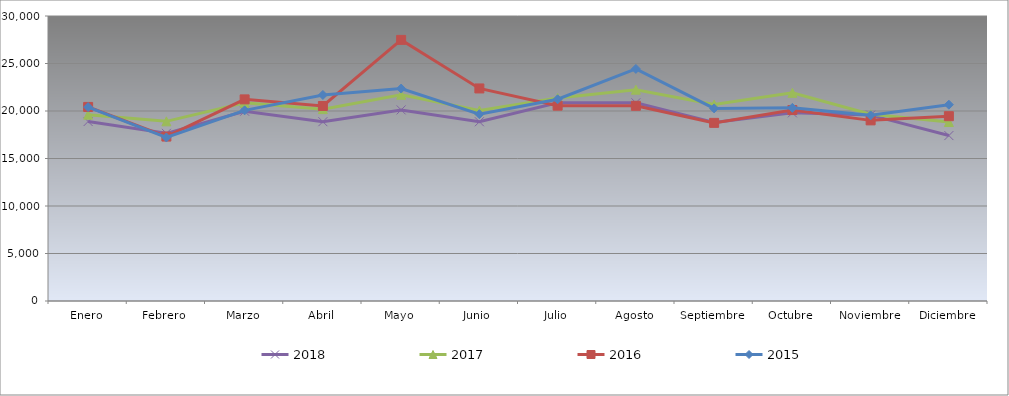
| Category | 2018 | 2017 | 2016 | 2015 |
|---|---|---|---|---|
| Enero | 18891.929 | 19612.958 | 20428.628 | 20410.934 |
| Febrero | 17649.157 | 18910.941 | 17308.393 | 17213.588 |
| Marzo | 19975.273 | 20868.137 | 21223.334 | 20069.044 |
| Abril | 18874.001 | 20197.657 | 20529.602 | 21689.363 |
| Mayo | 20115.493 | 21708.918 | 27485.62 | 22360.411 |
| Junio | 18866.958 | 20060.786 | 22374.568 | 19665.396 |
| Julio | 20873.577 | 21364.532 | 20560.144 | 21235.419 |
| Agosto | 20867.175 | 22243.788 | 20547.055 | 24429.582 |
| Septiembre | 18786.924 | 20687.745 | 18750.083 | 20275.324 |
| Octubre | 19803.679 | 21912.648 | 20100.149 | 20329.441 |
| Noviembre | 19566.138 | 19653.957 | 19013.739 | 19542.519 |
| Diciembre | 17413.536 | 18839.036 | 19453.788 | 20663.055 |